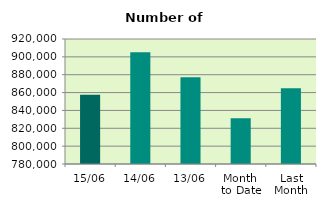
| Category | Series 0 |
|---|---|
| 15/06 | 857494 |
| 14/06 | 905084 |
| 13/06 | 877262 |
| Month 
to Date | 831317.455 |
| Last
Month | 864947.182 |